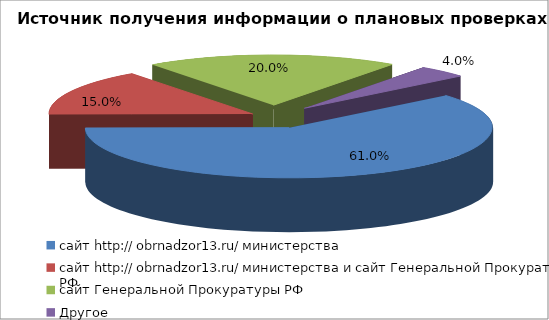
| Category | Series 0 |
|---|---|
| сайт http:// obrnadzor13.ru/ министерства | 0.61 |
| сайт http:// obrnadzor13.ru/ министерства и сайт Генеральной Прокуратуры РФ | 0.15 |
| сайт Генеральной Прокуратуры РФ | 0.2 |
| Другое | 0.04 |